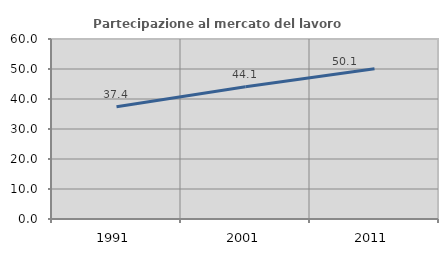
| Category | Partecipazione al mercato del lavoro  femminile |
|---|---|
| 1991.0 | 37.43 |
| 2001.0 | 44.055 |
| 2011.0 | 50.056 |